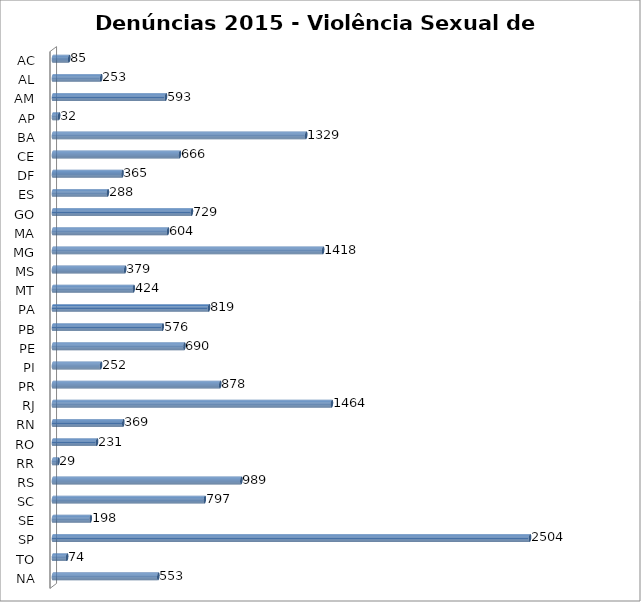
| Category | Series 0 |
|---|---|
| AC | 85 |
| AL | 253 |
| AM | 593 |
| AP | 32 |
| BA | 1329 |
| CE | 666 |
| DF | 365 |
| ES | 288 |
| GO | 729 |
| MA | 604 |
| MG | 1418 |
| MS | 379 |
| MT | 424 |
| PA | 819 |
| PB | 576 |
| PE | 690 |
| PI | 252 |
| PR | 878 |
| RJ | 1464 |
| RN | 369 |
| RO | 231 |
| RR | 29 |
| RS | 989 |
| SC | 797 |
| SE | 198 |
| SP | 2504 |
| TO | 74 |
| NA | 553 |